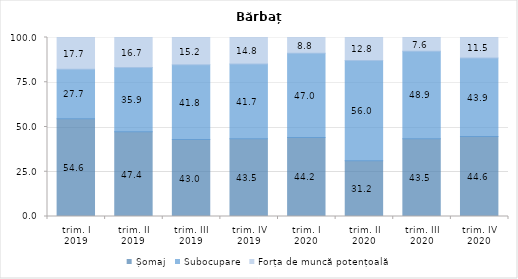
| Category | Șomaj | Subocupare | Forța de muncă potențoală |
|---|---|---|---|
| trim. I
2019 | 54.579 | 27.739 | 17.682 |
| trim. II
2019 | 47.357 | 35.946 | 16.698 |
| trim. III
2019 | 42.974 | 41.812 | 15.214 |
| trim. IV
2019 | 43.463 | 41.718 | 14.82 |
| trim. I
2020 | 44.187 | 47.049 | 8.765 |
| trim. II
2020 | 31.174 | 56.011 | 12.815 |
| trim. III
2020 | 43.485 | 48.878 | 7.637 |
| trim. IV
2020 | 44.632 | 43.881 | 11.487 |